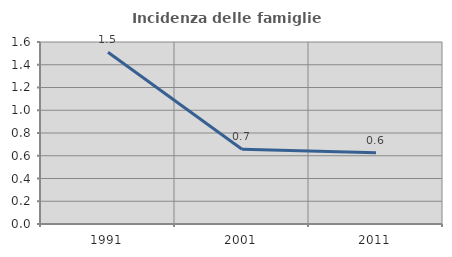
| Category | Incidenza delle famiglie numerose |
|---|---|
| 1991.0 | 1.511 |
| 2001.0 | 0.658 |
| 2011.0 | 0.627 |